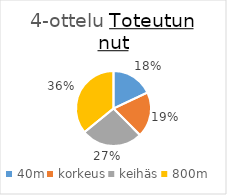
| Category | Series 0 |
|---|---|
| 40m | 130 |
| korkeus | 141 |
| keihäs | 192 |
| 800m | 259 |